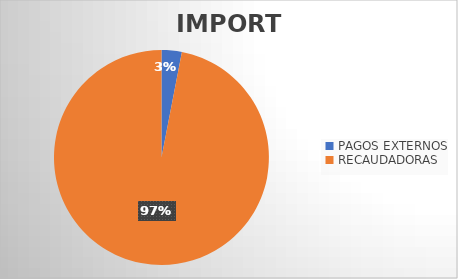
| Category | IMPORTE |
|---|---|
| PAGOS EXTERNOS | 5973640.81 |
| RECAUDADORAS | 190366788.91 |